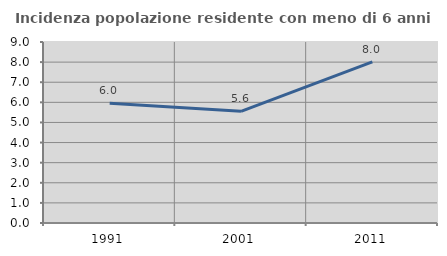
| Category | Incidenza popolazione residente con meno di 6 anni |
|---|---|
| 1991.0 | 5.955 |
| 2001.0 | 5.551 |
| 2011.0 | 8.009 |